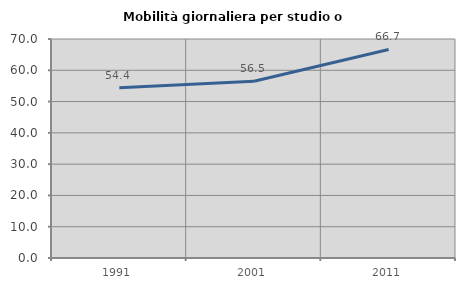
| Category | Mobilità giornaliera per studio o lavoro |
|---|---|
| 1991.0 | 54.412 |
| 2001.0 | 56.494 |
| 2011.0 | 66.667 |